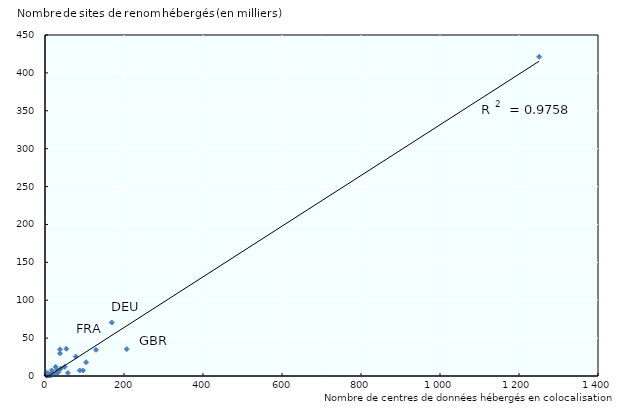
| Category | Series 0 |
|---|---|
| 1251.0 | 421228 |
| 169.0 | 70587 |
| 54.0 | 35908 |
| 207.0 | 35500 |
| 38.0 | 35245 |
| 129.0 | 34498 |
| 38.0 | 29898 |
| 78.0 | 25632 |
| 104.0 | 18116 |
| 27.0 | 12109 |
| 50.0 | 12062 |
| 40.0 | 9764 |
| 31.0 | 8498 |
| 17.0 | 7319 |
| 88.0 | 7299 |
| 96.0 | 7254 |
| 34.0 | 5201 |
| 4.0 | 4252 |
| 29.0 | 4170 |
| 18.0 | 4109 |
| 58.0 | 4014 |
| 8.0 | 3044 |
| 17.0 | 2351 |
| 28.0 | 2275 |
| 17.0 | 1961 |
| nan | 1775 |
| 24.0 | 1757 |
| 12.0 | 1687 |
| 14.0 | 1372 |
| 8.0 | 1156 |
| 16.0 | 1040 |
| 10.0 | 914 |
| 7.0 | 859 |
| 4.0 | 839 |
| 12.0 | 665 |
| 7.0 | 657 |
| 4.0 | 319 |